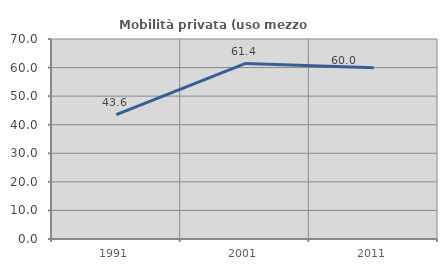
| Category | Mobilità privata (uso mezzo privato) |
|---|---|
| 1991.0 | 43.552 |
| 2001.0 | 61.386 |
| 2011.0 | 59.954 |